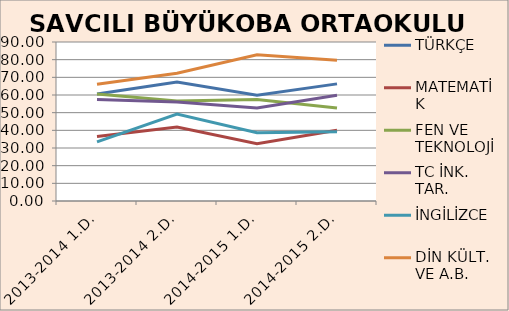
| Category | TÜRKÇE | MATEMATİK | FEN VE TEKNOLOJİ | TC İNK. TAR. | İNGİLİZCE | DİN KÜLT. VE A.B. |
|---|---|---|---|---|---|---|
| 2013-2014 1.D. | 60.61 | 36.53 | 60.61 | 57.42 | 33.48 | 66.06 |
| 2013-2014 2.D. | 67.35 | 41.91 | 56.62 | 56.03 | 49.26 | 72.35 |
| 2014-2015 1.D. | 59.81 | 32.41 | 57.41 | 52.59 | 38.7 | 82.78 |
| 2014-2015 2.D. | 66.3 | 40 | 52.59 | 59.81 | 39.26 | 79.63 |